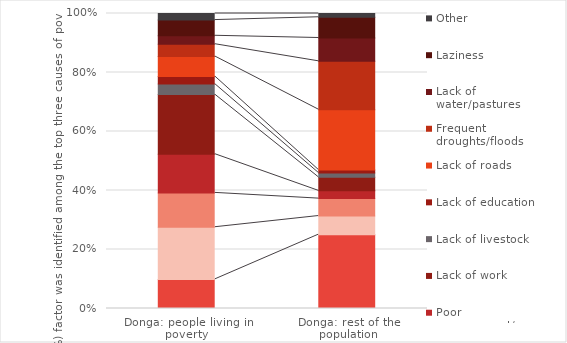
| Category | Lack of land | Cost of living | Poor agricultural product sales | Poor management/corruption | Lack of work | Lack of livestock | Lack of education | Lack of roads | Frequent droughts/floods | Lack of water/pastures | Laziness | Other |
|---|---|---|---|---|---|---|---|---|---|---|---|---|
| Donga: people living in poverty | 0.263 | 0.471 | 0.31 | 0.35 | 0.538 | 0.095 | 0.069 | 0.18 | 0.111 | 0.076 | 0.142 | 0.059 |
| Donga: rest of the population | 0.723 | 0.182 | 0.171 | 0.076 | 0.133 | 0.043 | 0.029 | 0.59 | 0.473 | 0.228 | 0.203 | 0.037 |